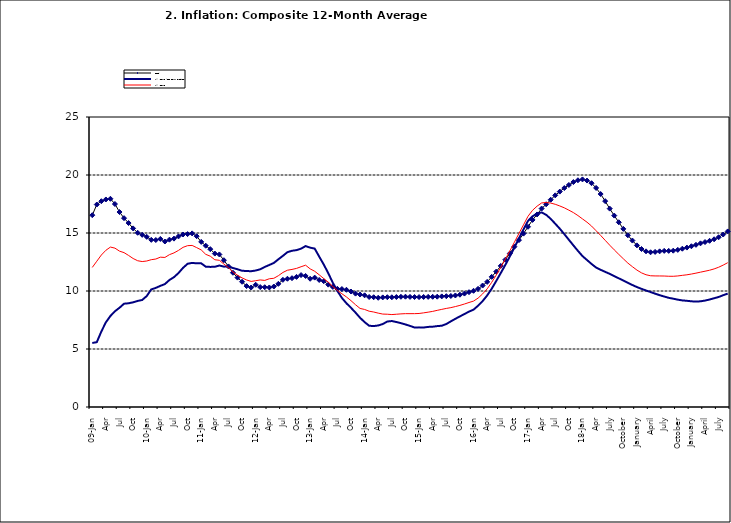
| Category | Food | All Items less Farm Produce | All Items |
|---|---|---|---|
| 09-Jan | 16.536 | 5.519 | 12.032 |
| Feb | 17.454 | 5.591 | 12.567 |
| Mar | 17.742 | 6.51 | 13.101 |
| Apr | 17.89 | 7.302 | 13.51 |
| May | 17.949 | 7.847 | 13.787 |
| June | 17.498 | 8.259 | 13.694 |
| Jul | 16.808 | 8.554 | 13.437 |
| Aug | 16.278 | 8.906 | 13.307 |
| Sep | 15.859 | 8.942 | 13.065 |
| Oct | 15.396 | 9.024 | 12.803 |
| Nov | 15.018 | 9.143 | 12.609 |
| Dec | 14.841 | 9.226 | 12.538 |
| 10-Jan | 14.668 | 9.567 | 12.586 |
| Feb | 14.411 | 10.138 | 12.7 |
| Mar | 14.395 | 10.269 | 12.757 |
| Apr | 14.489 | 10.444 | 12.915 |
| May | 14.266 | 10.597 | 12.893 |
| Jun | 14.424 | 10.948 | 13.132 |
| Jul | 14.514 | 11.193 | 13.284 |
| Aug | 14.706 | 11.549 | 13.5 |
| Sep | 14.872 | 11.997 | 13.764 |
| Oct | 14.906 | 12.345 | 13.908 |
| Nov | 14.967 | 12.423 | 13.928 |
| Dec | 14.723 | 12.383 | 13.74 |
| 11-Jan | 14.233 | 12.385 | 13.542 |
| Feb | 13.903 | 12.099 | 13.161 |
| Mar | 13.606 | 12.077 | 13.001 |
| Apr | 13.227 | 12.088 | 12.694 |
| May | 13.152 | 12.198 | 12.648 |
| Jun | 12.654 | 12.1 | 12.321 |
| Jul | 12.118 | 12.109 | 12.009 |
| Aug | 11.575 | 11.98 | 11.635 |
| Sep | 11.155 | 11.877 | 11.363 |
| Oct | 10.797 | 11.746 | 11.13 |
| Nov | 10.422 | 11.721 | 10.952 |
| Dec | 10.298 | 11.706 | 10.826 |
| 12-Jan | 10.538 | 11.765 | 10.886 |
| 12-Feb | 10.336 | 11.872 | 10.955 |
| 12-Mar | 10.325 | 12.075 | 10.914 |
| Apr | 10.304 | 12.242 | 11.054 |
| May | 10.387 | 12.419 | 11.096 |
| Jun | 10.617 | 12.732 | 11.32 |
| Jul | 10.963 | 13.032 | 11.599 |
| Aug | 11.056 | 13.349 | 11.791 |
| Sep | 11.104 | 13.467 | 11.859 |
| Oct | 11.216 | 13.525 | 11.948 |
| Nov | 11.372 | 13.649 | 12.091 |
| Dec | 11.296 | 13.873 | 12.224 |
| 13-Jan | 11.055 | 13.737 | 11.908 |
| Feb | 11.153 | 13.657 | 11.703 |
| Mar | 10.951 | 12.963 | 11.394 |
| Apr | 10.844 | 12.281 | 11.072 |
| May | 10.548 | 11.531 | 10.761 |
| Jun | 10.352 | 10.704 | 10.383 |
| Jul | 10.186 | 10.005 | 10.047 |
| Aug | 10.168 | 9.4 | 9.761 |
| Sep | 10.105 | 8.939 | 9.486 |
| Oct | 9.955 | 8.553 | 9.167 |
| Nov | 9.774 | 8.136 | 8.815 |
| Dec | 9.695 | 7.691 | 8.496 |
| 14-Jan | 9.626 | 7.317 | 8.408 |
| Feb | 9.484 | 7.005 | 8.257 |
| Mar | 9.464 | 6.976 | 8.19 |
| Apr | 9.416 | 7.03 | 8.092 |
| May | 9.448 | 7.151 | 8.012 |
| Jun | 9.464 | 7.369 | 7.998 |
| Jul | 9.459 | 7.411 | 7.968 |
| Aug | 9.481 | 7.325 | 7.996 |
| Sep | 9.501 | 7.228 | 8.027 |
| Oct | 9.508 | 7.116 | 8.047 |
| Nov | 9.492 | 6.991 | 8.046 |
| Dec | 9.481 | 6.854 | 8.047 |
| 15-Jan | 9.475 | 6.865 | 8.063 |
| Feb | 9.486 | 6.852 | 8.117 |
| Mar | 9.495 | 6.905 | 8.176 |
| Apr | 9.501 | 6.922 | 8.243 |
| May | 9.51 | 6.975 | 8.331 |
| Jun | 9.535 | 7.006 | 8.417 |
| Jul | 9.552 | 7.154 | 8.497 |
| Aug | 9.571 | 7.384 | 8.566 |
| Sep | 9.614 | 7.605 | 8.658 |
| Oct | 9.68 | 7.812 | 8.76 |
| Nov | 9.778 | 8.016 | 8.879 |
| Dec | 9.898 | 8.222 | 9.009 |
| 16-Jan | 10.017 | 8.391 | 9.13 |
| Feb | 10.184 | 8.732 | 9.386 |
| Mar | 10.471 | 9.132 | 9.751 |
| Apr | 10.786 | 9.614 | 10.182 |
| May | 11.221 | 10.196 | 10.746 |
| Jun | 11.672 | 10.864 | 11.372 |
| Jul | 12.162 | 11.553 | 12.045 |
| Aug | 12.696 | 12.247 | 12.744 |
| Sep | 13.238 | 12.98 | 13.454 |
| Oct | 13.817 | 13.757 | 14.206 |
| Nov | 14.386 | 14.542 | 14.958 |
| Dec | 14.946 | 15.307 | 15.697 |
| 17-Jan | 15.536 | 16.042 | 16.441 |
| Feb | 16.127 | 16.436 | 16.958 |
| Mar | 16.598 | 16.682 | 17.315 |
| Apr | 17.106 | 16.772 | 17.591 |
| May | 17.477 | 16.567 | 17.628 |
| Jun | 17.868 | 16.219 | 17.578 |
| Jul | 18.247 | 15.798 | 17.475 |
| Aug | 18.569 | 15.372 | 17.331 |
| Sep | 18.876 | 14.903 | 17.17 |
| Oct | 19.14 | 14.415 | 16.968 |
| Nov | 19.392 | 13.93 | 16.76 |
| Dec | 19.546 | 13.458 | 16.502 |
| 18-Jan | 19.621 | 13.01 | 16.215 |
| Feb | 19.521 | 12.668 | 15.93 |
| Mar | 19.294 | 12.33 | 15.599 |
| Apr | 18.886 | 12.021 | 15.196 |
| May | 18.359 | 11.828 | 14.793 |
| June | 17.745 | 11.651 | 14.371 |
| July | 17.102 | 11.478 | 13.95 |
| August | 16.501 | 11.285 | 13.546 |
| September | 15.923 | 11.092 | 13.157 |
| October | 15.355 | 10.903 | 12.777 |
| November | 14.802 | 10.703 | 12.406 |
| December | 14.348 | 10.514 | 12.095 |
| January | 13.934 | 10.339 | 11.801 |
| February | 13.62 | 10.185 | 11.564 |
| March | 13.42 | 10.044 | 11.401 |
| April | 13.339 | 9.909 | 11.314 |
| May | 13.371 | 9.77 | 11.299 |
| June | 13.418 | 9.64 | 11.297 |
| July | 13.46 | 9.524 | 11.291 |
| August | 13.458 | 9.411 | 11.271 |
| September | 13.474 | 9.337 | 11.268 |
| October | 13.544 | 9.253 | 11.298 |
| November | 13.646 | 9.189 | 11.348 |
| December | 13.743 | 9.155 | 11.396 |
| January | 13.859 | 9.112 | 11.462 |
| February | 13.98 | 9.086 | 11.539 |
| March | 14.109 | 9.112 | 11.624 |
| April | 14.221 | 9.174 | 11.706 |
| May | 14.325 | 9.267 | 11.791 |
| June | 14.46 | 9.375 | 11.904 |
| July | 14.634 | 9.484 | 12.049 |
| August | 14.869 | 9.638 | 12.233 |
| September | 15.135 | 9.775 | 12.44 |